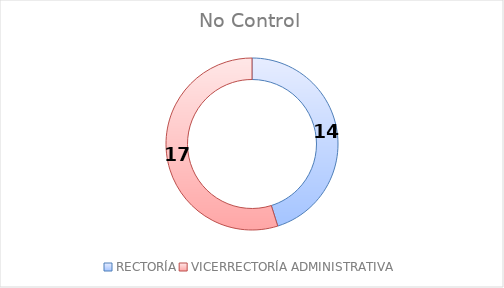
| Category | No Control |
|---|---|
| RECTORÍA | 14 |
| VICERRECTORÍA ADMINISTRATIVA | 17 |